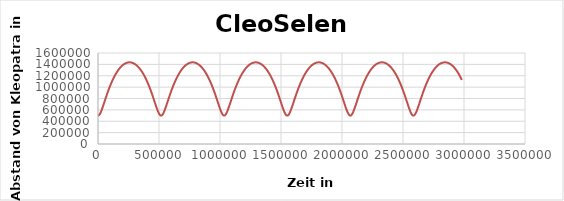
| Category | CleoSelene |
|---|---|
| 0.0 | 499000 |
| 3000.0 | 500168.055 |
| 6000.0 | 503644.83 |
| 9000.0 | 509350.566 |
| 12000.0 | 517159.925 |
| 15000.0 | 526911.892 |
| 18000.0 | 538421.155 |
| 21000.0 | 551489.378 |
| 24000.0 | 565915.145 |
| 27000.0 | 581501.897 |
| 30000.0 | 598063.638 |
| 33000.0 | 615428.585 |
| 36000.0 | 633441.069 |
| 39000.0 | 651962.131 |
| 42000.0 | 670869.187 |
| 45000.0 | 690055.098 |
| 48000.0 | 709426.911 |
| 51000.0 | 728904.446 |
| 54000.0 | 748418.857 |
| 57000.0 | 767911.251 |
| 60000.0 | 787331.403 |
| 63000.0 | 806636.596 |
| 66000.0 | 825790.58 |
| 69000.0 | 844762.67 |
| 72000.0 | 863526.948 |
| 75000.0 | 882061.578 |
| 78000.0 | 900348.216 |
| 81000.0 | 918371.506 |
| 84000.0 | 936118.64 |
| 87000.0 | 953578.987 |
| 90000.0 | 970743.781 |
| 93000.0 | 987605.843 |
| 96000.0 | 1004159.352 |
| 99000.0 | 1020399.647 |
| 102000.0 | 1036323.055 |
| 105000.0 | 1051926.749 |
| 108000.0 | 1067208.62 |
| 111000.0 | 1082167.172 |
| 114000.0 | 1096801.433 |
| 117000.0 | 1111110.869 |
| 120000.0 | 1125095.324 |
| 123000.0 | 1138754.957 |
| 126000.0 | 1152090.194 |
| 129000.0 | 1165101.683 |
| 132000.0 | 1177790.256 |
| 135000.0 | 1190156.901 |
| 138000.0 | 1202202.728 |
| 141000.0 | 1213928.949 |
| 144000.0 | 1225336.856 |
| 147000.0 | 1236427.801 |
| 150000.0 | 1247203.184 |
| 153000.0 | 1257664.436 |
| 156000.0 | 1267813.009 |
| 159000.0 | 1277650.364 |
| 162000.0 | 1287177.965 |
| 165000.0 | 1296397.269 |
| 168000.0 | 1305309.72 |
| 171000.0 | 1313916.744 |
| 174000.0 | 1322219.743 |
| 177000.0 | 1330220.09 |
| 180000.0 | 1337919.128 |
| 183000.0 | 1345318.165 |
| 186000.0 | 1352418.471 |
| 189000.0 | 1359221.276 |
| 192000.0 | 1365727.768 |
| 195000.0 | 1371939.093 |
| 198000.0 | 1377856.35 |
| 201000.0 | 1383480.593 |
| 204000.0 | 1388812.828 |
| 207000.0 | 1393854.013 |
| 210000.0 | 1398605.057 |
| 213000.0 | 1403066.819 |
| 216000.0 | 1407240.11 |
| 219000.0 | 1411125.689 |
| 222000.0 | 1414724.263 |
| 225000.0 | 1418036.489 |
| 228000.0 | 1421062.974 |
| 231000.0 | 1423804.271 |
| 234000.0 | 1426260.884 |
| 237000.0 | 1428433.263 |
| 240000.0 | 1430321.807 |
| 243000.0 | 1431926.863 |
| 246000.0 | 1433248.727 |
| 249000.0 | 1434287.642 |
| 252000.0 | 1435043.798 |
| 255000.0 | 1435517.336 |
| 258000.0 | 1435708.343 |
| 261000.0 | 1435616.853 |
| 264000.0 | 1435242.85 |
| 267000.0 | 1434586.265 |
| 270000.0 | 1433646.977 |
| 273000.0 | 1432424.813 |
| 276000.0 | 1430919.548 |
| 279000.0 | 1429130.906 |
| 282000.0 | 1427058.557 |
| 285000.0 | 1424702.12 |
| 288000.0 | 1422061.164 |
| 291000.0 | 1419135.203 |
| 294000.0 | 1415923.702 |
| 297000.0 | 1412426.072 |
| 300000.0 | 1408641.675 |
| 303000.0 | 1404569.821 |
| 306000.0 | 1400209.769 |
| 309000.0 | 1395560.726 |
| 312000.0 | 1390621.85 |
| 315000.0 | 1385392.251 |
| 318000.0 | 1379870.986 |
| 321000.0 | 1374057.068 |
| 324000.0 | 1367949.458 |
| 327000.0 | 1361547.073 |
| 330000.0 | 1354848.784 |
| 333000.0 | 1347853.417 |
| 336000.0 | 1340559.757 |
| 339000.0 | 1332966.548 |
| 342000.0 | 1325072.495 |
| 345000.0 | 1316876.267 |
| 348000.0 | 1308376.501 |
| 351000.0 | 1299571.804 |
| 354000.0 | 1290460.76 |
| 357000.0 | 1281041.928 |
| 360000.0 | 1271313.858 |
| 363000.0 | 1261275.085 |
| 366000.0 | 1250924.148 |
| 369000.0 | 1240259.589 |
| 372000.0 | 1229279.968 |
| 375000.0 | 1217983.875 |
| 378000.0 | 1206369.938 |
| 381000.0 | 1194436.842 |
| 384000.0 | 1182183.344 |
| 387000.0 | 1169608.296 |
| 390000.0 | 1156710.665 |
| 393000.0 | 1143489.56 |
| 396000.0 | 1129944.263 |
| 399000.0 | 1116074.266 |
| 402000.0 | 1101879.311 |
| 405000.0 | 1087359.437 |
| 408000.0 | 1072515.036 |
| 411000.0 | 1057346.919 |
| 414000.0 | 1041856.387 |
| 417000.0 | 1026045.322 |
| 420000.0 | 1009916.285 |
| 423000.0 | 993472.634 |
| 426000.0 | 976718.666 |
| 429000.0 | 959659.771 |
| 432000.0 | 942302.626 |
| 435000.0 | 924655.408 |
| 438000.0 | 906728.059 |
| 441000.0 | 888532.577 |
| 444000.0 | 870083.378 |
| 447000.0 | 851397.699 |
| 450000.0 | 832496.082 |
| 453000.0 | 813402.934 |
| 456000.0 | 794147.176 |
| 459000.0 | 774763.001 |
| 462000.0 | 755290.735 |
| 465000.0 | 735777.833 |
| 468000.0 | 716279.993 |
| 471000.0 | 696862.403 |
| 474000.0 | 677601.086 |
| 477000.0 | 658584.333 |
| 480000.0 | 639914.129 |
| 483000.0 | 621707.49 |
| 486000.0 | 604097.533 |
| 489000.0 | 587234.05 |
| 492000.0 | 571283.29 |
| 495000.0 | 556426.56 |
| 498000.0 | 542857.238 |
| 501000.0 | 530775.819 |
| 504000.0 | 520382.766 |
| 507000.0 | 511869.216 |
| 510000.0 | 505406.067 |
| 513000.0 | 501132.469 |
| 516000.0 | 499145.201 |
| 519000.0 | 499490.622 |
| 522000.0 | 502160.612 |
| 525000.0 | 507093.29 |
| 528000.0 | 514178.372 |
| 531000.0 | 523266.152 |
| 534000.0 | 534178.556 |
| 537000.0 | 546720.613 |
| 540000.0 | 560690.975 |
| 543000.0 | 575890.604 |
| 546000.0 | 592129.27 |
| 549000.0 | 609229.883 |
| 552000.0 | 627030.972 |
| 555000.0 | 645387.689 |
| 558000.0 | 664171.764 |
| 561000.0 | 683270.747 |
| 564000.0 | 702586.846 |
| 567000.0 | 722035.546 |
| 570000.0 | 741544.169 |
| 573000.0 | 761050.468 |
| 576000.0 | 780501.306 |
| 579000.0 | 799851.443 |
| 582000.0 | 819062.463 |
| 585000.0 | 838101.816 |
| 588000.0 | 856941.987 |
| 591000.0 | 875559.776 |
| 594000.0 | 893935.671 |
| 597000.0 | 912053.315 |
| 600000.0 | 929899.048 |
| 603000.0 | 947461.512 |
| 606000.0 | 964731.316 |
| 609000.0 | 981700.751 |
| 612000.0 | 998363.542 |
| 615000.0 | 1014714.64 |
| 618000.0 | 1030750.041 |
| 621000.0 | 1046466.636 |
| 624000.0 | 1061862.076 |
| 627000.0 | 1076934.661 |
| 630000.0 | 1091683.242 |
| 633000.0 | 1106107.14 |
| 636000.0 | 1120206.074 |
| 639000.0 | 1133980.097 |
| 642000.0 | 1147429.546 |
| 645000.0 | 1160554.995 |
| 648000.0 | 1173357.217 |
| 651000.0 | 1185837.148 |
| 654000.0 | 1197995.856 |
| 657000.0 | 1209834.521 |
| 660000.0 | 1221354.41 |
| 663000.0 | 1232556.854 |
| 666000.0 | 1243443.238 |
| 669000.0 | 1254014.985 |
| 672000.0 | 1264273.539 |
| 675000.0 | 1274220.36 |
| 678000.0 | 1283856.912 |
| 681000.0 | 1293184.654 |
| 684000.0 | 1302205.038 |
| 687000.0 | 1310919.494 |
| 690000.0 | 1319329.433 |
| 693000.0 | 1327436.241 |
| 696000.0 | 1335241.271 |
| 699000.0 | 1342745.843 |
| 702000.0 | 1349951.241 |
| 705000.0 | 1356858.709 |
| 708000.0 | 1363469.451 |
| 711000.0 | 1369784.627 |
| 714000.0 | 1375805.353 |
| 717000.0 | 1381532.699 |
| 720000.0 | 1386967.688 |
| 723000.0 | 1392111.295 |
| 726000.0 | 1396964.447 |
| 729000.0 | 1401528.02 |
| 732000.0 | 1405802.842 |
| 735000.0 | 1409789.69 |
| 738000.0 | 1413489.29 |
| 741000.0 | 1416902.316 |
| 744000.0 | 1420029.394 |
| 747000.0 | 1422871.094 |
| 750000.0 | 1425427.939 |
| 753000.0 | 1427700.397 |
| 756000.0 | 1429688.886 |
| 759000.0 | 1431393.771 |
| 762000.0 | 1432815.365 |
| 765000.0 | 1433953.93 |
| 768000.0 | 1434809.676 |
| 771000.0 | 1435382.759 |
| 774000.0 | 1435673.287 |
| 777000.0 | 1435681.312 |
| 780000.0 | 1435406.835 |
| 783000.0 | 1434849.807 |
| 786000.0 | 1434010.124 |
| 789000.0 | 1432887.632 |
| 792000.0 | 1431482.125 |
| 795000.0 | 1429793.343 |
| 798000.0 | 1427820.976 |
| 801000.0 | 1425564.662 |
| 804000.0 | 1423023.987 |
| 807000.0 | 1420198.483 |
| 810000.0 | 1417087.634 |
| 813000.0 | 1413690.869 |
| 816000.0 | 1410007.569 |
| 819000.0 | 1406037.06 |
| 822000.0 | 1401778.619 |
| 825000.0 | 1397231.472 |
| 828000.0 | 1392394.796 |
| 831000.0 | 1387267.715 |
| 834000.0 | 1381849.306 |
| 837000.0 | 1376138.597 |
| 840000.0 | 1370134.567 |
| 843000.0 | 1363836.149 |
| 846000.0 | 1357242.231 |
| 849000.0 | 1350351.652 |
| 852000.0 | 1343163.214 |
| 855000.0 | 1335675.674 |
| 858000.0 | 1327887.749 |
| 861000.0 | 1319798.122 |
| 864000.0 | 1311405.442 |
| 867000.0 | 1302708.324 |
| 870000.0 | 1293705.36 |
| 873000.0 | 1284395.118 |
| 876000.0 | 1274776.15 |
| 879000.0 | 1264846.996 |
| 882000.0 | 1254606.192 |
| 885000.0 | 1244052.278 |
| 888000.0 | 1233183.808 |
| 891000.0 | 1221999.358 |
| 894000.0 | 1210497.541 |
| 897000.0 | 1198677.021 |
| 900000.0 | 1186536.528 |
| 903000.0 | 1174074.878 |
| 906000.0 | 1161290.993 |
| 909000.0 | 1148183.93 |
| 912000.0 | 1134752.906 |
| 915000.0 | 1120997.335 |
| 918000.0 | 1106916.865 |
| 921000.0 | 1092511.425 |
| 924000.0 | 1077781.276 |
| 927000.0 | 1062727.074 |
| 930000.0 | 1047349.936 |
| 933000.0 | 1031651.531 |
| 936000.0 | 1015634.167 |
| 939000.0 | 999300.907 |
| 942000.0 | 982655.7 |
| 945000.0 | 965703.531 |
| 948000.0 | 948450.6 |
| 951000.0 | 930904.528 |
| 954000.0 | 913074.605 |
| 957000.0 | 894972.067 |
| 960000.0 | 876610.433 |
| 963000.0 | 858005.897 |
| 966000.0 | 839177.775 |
| 969000.0 | 820149.045 |
| 972000.0 | 800946.958 |
| 975000.0 | 781603.755 |
| 978000.0 | 762157.495 |
| 981000.0 | 742653.003 |
| 984000.0 | 723142.936 |
| 987000.0 | 703688.989 |
| 990000.0 | 684363.21 |
| 993000.0 | 665249.403 |
| 996000.0 | 646444.569 |
| 999000.0 | 628060.289 |
| 1002000.0 | 610223.91 |
| 1005000.0 | 593079.329 |
| 1008000.0 | 576787.087 |
| 1011000.0 | 561523.436 |
| 1014000.0 | 547477.96 |
| 1017000.0 | 534849.347 |
| 1020000.0 | 523839.026 |
| 1023000.0 | 514642.599 |
| 1026000.0 | 507439.404 |
| 1029000.0 | 502381.066 |
| 1032000.0 | 499580.376 |
| 1035000.0 | 499102.149 |
| 1038000.0 | 500957.626 |
| 1041000.0 | 505103.476 |
| 1044000.0 | 511445.602 |
| 1047000.0 | 519846.992 |
| 1050000.0 | 530138.246 |
| 1053000.0 | 542129.071 |
| 1056000.0 | 555619.268 |
| 1059000.0 | 570408.13 |
| 1062000.0 | 586301.722 |
| 1065000.0 | 603117.955 |
| 1068000.0 | 620689.675 |
| 1071000.0 | 638866.136 |
| 1074000.0 | 657513.286 |
| 1077000.0 | 676513.219 |
| 1080000.0 | 695763.129 |
| 1083000.0 | 715173.987 |
| 1086000.0 | 734669.11 |
| 1089000.0 | 754182.732 |
| 1092000.0 | 773658.651 |
| 1095000.0 | 793048.974 |
| 1098000.0 | 812312.997 |
| 1101000.0 | 831416.205 |
| 1104000.0 | 850329.397 |
| 1107000.0 | 869027.929 |
| 1110000.0 | 887491.054 |
| 1113000.0 | 905701.36 |
| 1116000.0 | 923644.286 |
| 1119000.0 | 941307.704 |
| 1122000.0 | 958681.564 |
| 1125000.0 | 975757.595 |
| 1128000.0 | 992529.043 |
| 1131000.0 | 1008990.449 |
| 1134000.0 | 1025137.459 |
| 1137000.0 | 1040966.665 |
| 1140000.0 | 1056475.463 |
| 1143000.0 | 1071661.938 |
| 1146000.0 | 1086524.756 |
| 1149000.0 | 1101063.082 |
| 1152000.0 | 1115276.502 |
| 1155000.0 | 1129164.956 |
| 1158000.0 | 1142728.689 |
| 1161000.0 | 1155968.196 |
| 1164000.0 | 1168884.183 |
| 1167000.0 | 1181477.531 |
| 1170000.0 | 1193749.267 |
| 1173000.0 | 1205700.534 |
| 1176000.0 | 1217332.57 |
| 1179000.0 | 1228646.685 |
| 1182000.0 | 1239644.247 |
| 1185000.0 | 1250326.668 |
| 1188000.0 | 1260695.385 |
| 1191000.0 | 1270751.853 |
| 1194000.0 | 1280497.537 |
| 1197000.0 | 1289933.898 |
| 1200000.0 | 1299062.391 |
| 1203000.0 | 1307884.454 |
| 1206000.0 | 1316401.507 |
| 1209000.0 | 1324614.943 |
| 1212000.0 | 1332526.129 |
| 1215000.0 | 1340136.395 |
| 1218000.0 | 1347447.039 |
| 1221000.0 | 1354459.32 |
| 1224000.0 | 1361174.455 |
| 1227000.0 | 1367593.621 |
| 1230000.0 | 1373717.949 |
| 1233000.0 | 1379548.525 |
| 1236000.0 | 1385086.389 |
| 1239000.0 | 1390332.534 |
| 1242000.0 | 1395287.902 |
| 1245000.0 | 1399953.389 |
| 1248000.0 | 1404329.838 |
| 1251000.0 | 1408418.046 |
| 1254000.0 | 1412218.755 |
| 1257000.0 | 1415732.659 |
| 1260000.0 | 1418960.4 |
| 1263000.0 | 1421902.569 |
| 1266000.0 | 1424559.704 |
| 1269000.0 | 1426932.293 |
| 1272000.0 | 1429020.772 |
| 1275000.0 | 1430825.524 |
| 1278000.0 | 1432346.88 |
| 1281000.0 | 1433585.122 |
| 1284000.0 | 1434540.476 |
| 1287000.0 | 1435213.119 |
| 1290000.0 | 1435603.174 |
| 1293000.0 | 1435710.714 |
| 1296000.0 | 1435535.758 |
| 1299000.0 | 1435078.273 |
| 1302000.0 | 1434338.176 |
| 1305000.0 | 1433315.331 |
| 1308000.0 | 1432009.548 |
| 1311000.0 | 1430420.589 |
| 1314000.0 | 1428548.16 |
| 1317000.0 | 1426391.917 |
| 1320000.0 | 1423951.464 |
| 1323000.0 | 1421226.354 |
| 1326000.0 | 1418216.086 |
| 1329000.0 | 1414920.109 |
| 1332000.0 | 1411337.821 |
| 1335000.0 | 1407468.567 |
| 1338000.0 | 1403311.642 |
| 1341000.0 | 1398866.29 |
| 1344000.0 | 1394131.704 |
| 1347000.0 | 1389107.027 |
| 1350000.0 | 1383791.353 |
| 1353000.0 | 1378183.727 |
| 1356000.0 | 1372283.145 |
| 1359000.0 | 1366088.556 |
| 1362000.0 | 1359598.864 |
| 1365000.0 | 1352812.925 |
| 1368000.0 | 1345729.554 |
| 1371000.0 | 1338347.523 |
| 1374000.0 | 1330665.564 |
| 1377000.0 | 1322682.371 |
| 1380000.0 | 1314396.603 |
| 1383000.0 | 1305806.89 |
| 1386000.0 | 1296911.829 |
| 1389000.0 | 1287709.997 |
| 1392000.0 | 1278199.95 |
| 1395000.0 | 1268380.233 |
| 1398000.0 | 1258249.381 |
| 1401000.0 | 1247805.933 |
| 1404000.0 | 1237048.435 |
| 1407000.0 | 1225975.456 |
| 1410000.0 | 1214585.594 |
| 1413000.0 | 1202877.493 |
| 1416000.0 | 1190849.857 |
| 1419000.0 | 1178501.47 |
| 1422000.0 | 1165831.214 |
| 1425000.0 | 1152838.096 |
| 1428000.0 | 1139521.272 |
| 1431000.0 | 1125880.082 |
| 1434000.0 | 1111914.089 |
| 1437000.0 | 1097623.115 |
| 1440000.0 | 1083007.299 |
| 1443000.0 | 1068067.149 |
| 1446000.0 | 1052803.612 |
| 1449000.0 | 1037218.152 |
| 1452000.0 | 1021312.84 |
| 1455000.0 | 1005090.459 |
| 1458000.0 | 988554.63 |
| 1461000.0 | 971709.954 |
| 1464000.0 | 954562.181 |
| 1467000.0 | 937118.406 |
| 1470000.0 | 919387.301 |
| 1473000.0 | 901379.379 |
| 1476000.0 | 883107.317 |
| 1479000.0 | 864586.315 |
| 1482000.0 | 845834.535 |
| 1485000.0 | 826873.599 |
| 1488000.0 | 807729.175 |
| 1491000.0 | 788431.659 |
| 1494000.0 | 769016.958 |
| 1497000.0 | 749527.399 |
| 1500000.0 | 730012.749 |
| 1503000.0 | 710531.374 |
| 1506000.0 | 691151.52 |
| 1509000.0 | 671952.683 |
| 1512000.0 | 653027.055 |
| 1515000.0 | 634480.929 |
| 1518000.0 | 616435.985 |
| 1521000.0 | 599030.235 |
| 1524000.0 | 582418.404 |
| 1527000.0 | 566771.397 |
| 1530000.0 | 552274.481 |
| 1533000.0 | 539123.747 |
| 1536000.0 | 527520.528 |
| 1539000.0 | 517663.584 |
| 1542000.0 | 509739.261 |
| 1545000.0 | 503910.265 |
| 1548000.0 | 500304.249 |
| 1551000.0 | 499003.778 |
| 1554000.0 | 500039.328 |
| 1557000.0 | 503386.601 |
| 1560000.0 | 508968.67 |
| 1563000.0 | 516662.543 |
| 1566000.0 | 526308.931 |
| 1569000.0 | 537723.595 |
| 1572000.0 | 550708.655 |
| 1575000.0 | 565062.638 |
| 1578000.0 | 580588.533 |
| 1581000.0 | 597099.63 |
| 1584000.0 | 614423.271 |
| 1587000.0 | 632402.846 |
| 1590000.0 | 650898.45 |
| 1593000.0 | 669786.587 |
| 1596000.0 | 688959.273 |
| 1599000.0 | 708322.786 |
| 1602000.0 | 727796.26 |
| 1605000.0 | 747310.242 |
| 1608000.0 | 766805.308 |
| 1611000.0 | 786230.775 |
| 1614000.0 | 805543.527 |
| 1617000.0 | 824706.973 |
| 1620000.0 | 843690.133 |
| 1623000.0 | 862466.838 |
| 1626000.0 | 881015.037 |
| 1629000.0 | 899316.203 |
| 1632000.0 | 917354.82 |
| 1635000.0 | 935117.947 |
| 1638000.0 | 952594.839 |
| 1641000.0 | 969776.631 |
| 1644000.0 | 986656.06 |
| 1647000.0 | 1003227.234 |
| 1650000.0 | 1019485.431 |
| 1653000.0 | 1035426.926 |
| 1656000.0 | 1051048.846 |
| 1659000.0 | 1066349.047 |
| 1662000.0 | 1081325.999 |
| 1665000.0 | 1095978.702 |
| 1668000.0 | 1110306.6 |
| 1671000.0 | 1124309.517 |
| 1674000.0 | 1137987.596 |
| 1677000.0 | 1151341.247 |
| 1680000.0 | 1164371.109 |
| 1683000.0 | 1177078.003 |
| 1686000.0 | 1189462.909 |
| 1689000.0 | 1201526.932 |
| 1692000.0 | 1213271.277 |
| 1695000.0 | 1224697.233 |
| 1698000.0 | 1235806.149 |
| 1701000.0 | 1246599.422 |
| 1704000.0 | 1257078.482 |
| 1707000.0 | 1267244.78 |
| 1710000.0 | 1277099.777 |
| 1713000.0 | 1286644.938 |
| 1716000.0 | 1295881.718 |
| 1719000.0 | 1304811.565 |
| 1722000.0 | 1313435.904 |
| 1725000.0 | 1321756.138 |
| 1728000.0 | 1329773.644 |
| 1731000.0 | 1337489.765 |
| 1734000.0 | 1344905.812 |
| 1737000.0 | 1352023.057 |
| 1740000.0 | 1358842.732 |
| 1743000.0 | 1365366.028 |
| 1746000.0 | 1371594.092 |
| 1749000.0 | 1377528.028 |
| 1752000.0 | 1383168.89 |
| 1755000.0 | 1388517.689 |
| 1758000.0 | 1393575.385 |
| 1761000.0 | 1398342.889 |
| 1764000.0 | 1402821.065 |
| 1767000.0 | 1407010.725 |
| 1770000.0 | 1410912.63 |
| 1773000.0 | 1414527.491 |
| 1776000.0 | 1417855.969 |
| 1779000.0 | 1420898.673 |
| 1782000.0 | 1423656.159 |
| 1785000.0 | 1426128.933 |
| 1788000.0 | 1428317.449 |
| 1791000.0 | 1430222.109 |
| 1794000.0 | 1431843.263 |
| 1797000.0 | 1433181.21 |
| 1800000.0 | 1434236.194 |
| 1803000.0 | 1435008.411 |
| 1806000.0 | 1435498.003 |
| 1809000.0 | 1435705.06 |
| 1812000.0 | 1435629.62 |
| 1815000.0 | 1435271.669 |
| 1818000.0 | 1434631.141 |
| 1821000.0 | 1433707.919 |
| 1824000.0 | 1432501.832 |
| 1827000.0 | 1431012.658 |
| 1830000.0 | 1429240.124 |
| 1833000.0 | 1427183.903 |
| 1836000.0 | 1424843.618 |
| 1839000.0 | 1422218.838 |
| 1842000.0 | 1419309.084 |
| 1845000.0 | 1416113.82 |
| 1848000.0 | 1412632.463 |
| 1851000.0 | 1408864.377 |
| 1854000.0 | 1404808.874 |
| 1857000.0 | 1400465.216 |
| 1860000.0 | 1395832.614 |
| 1863000.0 | 1390910.228 |
| 1866000.0 | 1385697.171 |
| 1869000.0 | 1380192.503 |
| 1872000.0 | 1374395.238 |
| 1875000.0 | 1368304.343 |
| 1878000.0 | 1361918.735 |
| 1881000.0 | 1355237.288 |
| 1884000.0 | 1348258.832 |
| 1887000.0 | 1340982.153 |
| 1890000.0 | 1333405.997 |
| 1893000.0 | 1325529.071 |
| 1896000.0 | 1317350.047 |
| 1899000.0 | 1308867.563 |
| 1902000.0 | 1300080.229 |
| 1905000.0 | 1290986.627 |
| 1908000.0 | 1281585.322 |
| 1911000.0 | 1271874.859 |
| 1914000.0 | 1261853.778 |
| 1917000.0 | 1251520.615 |
| 1920000.0 | 1240873.913 |
| 1923000.0 | 1229912.231 |
| 1926000.0 | 1218634.155 |
| 1929000.0 | 1207038.311 |
| 1932000.0 | 1195123.382 |
| 1935000.0 | 1182888.119 |
| 1938000.0 | 1170331.369 |
| 1941000.0 | 1157452.09 |
| 1944000.0 | 1144249.384 |
| 1947000.0 | 1130722.521 |
| 1950000.0 | 1116870.981 |
| 1953000.0 | 1102694.49 |
| 1956000.0 | 1088193.069 |
| 1959000.0 | 1073367.089 |
| 1962000.0 | 1058217.333 |
| 1965000.0 | 1042745.075 |
| 1968000.0 | 1026952.159 |
| 1971000.0 | 1010841.105 |
| 1974000.0 | 994415.223 |
| 1977000.0 | 977678.752 |
| 1980000.0 | 960637.016 |
| 1983000.0 | 943296.611 |
| 1986000.0 | 925665.625 |
| 1989000.0 | 907753.891 |
| 1992000.0 | 889573.281 |
| 1995000.0 | 871138.064 |
| 1998000.0 | 852465.303 |
| 2001000.0 | 833575.34 |
| 2004000.0 | 814492.344 |
| 2007000.0 | 795244.963 |
| 2010000.0 | 775867.065 |
| 2013000.0 | 756398.604 |
| 2016000.0 | 736886.602 |
| 2019000.0 | 717386.256 |
| 2022000.0 | 697962.178 |
| 2025000.0 | 678689.739 |
| 2028000.0 | 659656.495 |
| 2031000.0 | 640963.614 |
| 2034000.0 | 622727.228 |
| 2037000.0 | 605079.515 |
| 2040000.0 | 588169.319 |
| 2043000.0 | 572161.978 |
| 2046000.0 | 557238.006 |
| 2049000.0 | 543590.207 |
| 2052000.0 | 531418.845 |
| 2055000.0 | 520924.612 |
| 2058000.0 | 512299.457 |
| 2061000.0 | 505715.737 |
| 2064000.0 | 501314.705 |
| 2067000.0 | 499195.797 |
| 2070000.0 | 499408.386 |
| 2073000.0 | 501947.475 |
| 2076000.0 | 506754.134 |
| 2079000.0 | 513720.617 |
| 2082000.0 | 522699.173 |
| 2085000.0 | 533513.028 |
| 2088000.0 | 545967.876 |
| 2091000.0 | 559862.478 |
| 2094000.0 | 574997.472 |
| 2097000.0 | 591181.99 |
| 2100000.0 | 608238.113 |
| 2103000.0 | 626003.444 |
| 2106000.0 | 644332.184 |
| 2109000.0 | 663095.136 |
| 2112000.0 | 682178.981 |
| 2115000.0 | 701485.128 |
| 2118000.0 | 720928.346 |
| 2121000.0 | 740435.325 |
| 2124000.0 | 759943.261 |
| 2127000.0 | 779398.531 |
| 2130000.0 | 798755.478 |
| 2133000.0 | 817975.325 |
| 2136000.0 | 837025.212 |
| 2139000.0 | 855877.359 |
| 2142000.0 | 874508.338 |
| 2145000.0 | 892898.441 |
| 2148000.0 | 911031.147 |
| 2151000.0 | 928892.653 |
| 2154000.0 | 946471.479 |
| 2157000.0 | 963758.132 |
| 2160000.0 | 980744.812 |
| 2163000.0 | 997425.171 |
| 2166000.0 | 1013794.094 |
| 2169000.0 | 1029847.522 |
| 2172000.0 | 1045582.3 |
| 2175000.0 | 1060996.037 |
| 2178000.0 | 1076087 |
| 2181000.0 | 1090854.011 |
| 2184000.0 | 1105296.367 |
| 2187000.0 | 1119413.764 |
| 2190000.0 | 1133206.24 |
| 2193000.0 | 1146674.116 |
| 2196000.0 | 1159817.955 |
| 2199000.0 | 1172638.517 |
| 2202000.0 | 1185136.73 |
| 2205000.0 | 1197313.658 |
| 2208000.0 | 1209170.473 |
| 2211000.0 | 1220708.437 |
| 2214000.0 | 1231928.88 |
| 2217000.0 | 1242833.183 |
| 2220000.0 | 1253422.767 |
| 2223000.0 | 1263699.076 |
| 2226000.0 | 1273663.568 |
| 2229000.0 | 1283317.708 |
| 2232000.0 | 1292662.957 |
| 2235000.0 | 1301700.764 |
| 2238000.0 | 1310432.563 |
| 2241000.0 | 1318859.766 |
| 2244000.0 | 1326983.759 |
| 2247000.0 | 1334805.899 |
| 2250000.0 | 1342327.506 |
| 2253000.0 | 1349549.867 |
| 2256000.0 | 1356474.229 |
| 2259000.0 | 1363101.798 |
| 2262000.0 | 1369433.736 |
| 2265000.0 | 1375471.162 |
| 2268000.0 | 1381215.148 |
| 2271000.0 | 1386666.72 |
| 2274000.0 | 1391826.857 |
| 2277000.0 | 1396696.486 |
| 2280000.0 | 1401276.489 |
| 2283000.0 | 1405567.695 |
| 2286000.0 | 1409570.884 |
| 2289000.0 | 1413286.785 |
| 2292000.0 | 1416716.076 |
| 2295000.0 | 1419859.383 |
| 2298000.0 | 1422717.283 |
| 2301000.0 | 1425290.299 |
| 2304000.0 | 1427578.902 |
| 2307000.0 | 1429583.514 |
| 2310000.0 | 1431304.502 |
| 2313000.0 | 1432742.184 |
| 2316000.0 | 1433896.823 |
| 2319000.0 | 1434768.632 |
| 2322000.0 | 1435357.772 |
| 2325000.0 | 1435664.35 |
| 2328000.0 | 1435688.425 |
| 2331000.0 | 1435429.999 |
| 2334000.0 | 1434889.026 |
| 2337000.0 | 1434065.405 |
| 2340000.0 | 1432958.986 |
| 2343000.0 | 1431569.564 |
| 2346000.0 | 1429896.884 |
| 2349000.0 | 1427940.638 |
| 2352000.0 | 1425700.467 |
| 2355000.0 | 1423175.959 |
| 2358000.0 | 1420366.651 |
| 2361000.0 | 1417272.029 |
| 2364000.0 | 1413891.524 |
| 2367000.0 | 1410224.52 |
| 2370000.0 | 1406270.348 |
| 2373000.0 | 1402028.285 |
| 2376000.0 | 1397497.563 |
| 2379000.0 | 1392677.359 |
| 2382000.0 | 1387566.801 |
| 2385000.0 | 1382164.97 |
| 2388000.0 | 1376470.894 |
| 2391000.0 | 1370483.557 |
| 2394000.0 | 1364201.894 |
| 2397000.0 | 1357624.795 |
| 2400000.0 | 1350751.103 |
| 2403000.0 | 1343579.62 |
| 2406000.0 | 1336109.107 |
| 2409000.0 | 1328338.283 |
| 2412000.0 | 1320265.833 |
| 2415000.0 | 1311890.407 |
| 2418000.0 | 1303210.623 |
| 2421000.0 | 1294225.074 |
| 2424000.0 | 1284932.328 |
| 2427000.0 | 1275330.939 |
| 2430000.0 | 1265419.447 |
| 2433000.0 | 1255196.388 |
| 2436000.0 | 1244660.302 |
| 2439000.0 | 1233809.742 |
| 2442000.0 | 1222643.281 |
| 2445000.0 | 1211159.532 |
| 2448000.0 | 1199357.154 |
| 2451000.0 | 1187234.872 |
| 2454000.0 | 1174791.498 |
| 2457000.0 | 1162025.947 |
| 2460000.0 | 1148937.268 |
| 2463000.0 | 1135524.667 |
| 2466000.0 | 1121787.546 |
| 2469000.0 | 1107725.54 |
| 2472000.0 | 1093338.56 |
| 2475000.0 | 1078626.845 |
| 2478000.0 | 1063591.028 |
| 2481000.0 | 1048232.199 |
| 2484000.0 | 1032551.991 |
| 2487000.0 | 1016552.674 |
| 2490000.0 | 1000237.264 |
| 2493000.0 | 983609.657 |
| 2496000.0 | 966674.774 |
| 2499000.0 | 949438.741 |
| 2502000.0 | 931909.092 |
| 2505000.0 | 914095.014 |
| 2508000.0 | 896007.625 |
| 2511000.0 | 877660.305 |
| 2514000.0 | 859069.083 |
| 2517000.0 | 840253.086 |
| 2520000.0 | 821235.067 |
| 2523000.0 | 802042.015 |
| 2526000.0 | 782705.869 |
| 2529000.0 | 763264.332 |
| 2532000.0 | 743761.816 |
| 2535000.0 | 724250.504 |
| 2538000.0 | 704791.543 |
| 2541000.0 | 685456.354 |
| 2544000.0 | 666328.037 |
| 2547000.0 | 647502.802 |
| 2550000.0 | 629091.37 |
| 2553000.0 | 611220.166 |
| 2556000.0 | 594032.134 |
| 2559000.0 | 577686.886 |
| 2562000.0 | 562359.828 |
| 2565000.0 | 548239.879 |
| 2568000.0 | 535525.362 |
| 2571000.0 | 524417.759 |
| 2574000.0 | 515113.268 |
| 2577000.0 | 507792.452 |
| 2580000.0 | 502608.82 |
| 2583000.0 | 499677.642 |
| 2586000.0 | 499066.646 |
| 2589000.0 | 500790.189 |
| 2592000.0 | 504807.986 |
| 2595000.0 | 511028.643 |
| 2598000.0 | 519317.324 |
| 2601000.0 | 529506.16 |
| 2604000.0 | 541405.743 |
| 2607000.0 | 554816.166 |
| 2610000.0 | 569536.533 |
| 2613000.0 | 585372.369 |
| 2616000.0 | 602140.812 |
| 2619000.0 | 619673.806 |
| 2622000.0 | 637819.658 |
| 2625000.0 | 656443.373 |
| 2628000.0 | 675426.155 |
| 2631000.0 | 694664.371 |
| 2634000.0 | 714068.25 |
| 2637000.0 | 733560.444 |
| 2640000.0 | 753074.605 |
| 2643000.0 | 772554.022 |
| 2646000.0 | 791950.362 |
| 2649000.0 | 811222.54 |
| 2652000.0 | 830335.713 |
| 2655000.0 | 849260.401 |
| 2658000.0 | 867971.718 |
| 2661000.0 | 886448.713 |
| 2664000.0 | 904673.799 |
| 2667000.0 | 922632.262 |
| 2670000.0 | 940311.846 |
| 2673000.0 | 957702.395 |
| 2676000.0 | 974795.541 |
| 2679000.0 | 991584.451 |
| 2682000.0 | 1008063.598 |
| 2685000.0 | 1024228.569 |
| 2688000.0 | 1040075.908 |
| 2691000.0 | 1055602.967 |
| 2694000.0 | 1070807.795 |
| 2697000.0 | 1085689.029 |
| 2700000.0 | 1100245.805 |
| 2703000.0 | 1114477.688 |
| 2706000.0 | 1128384.601 |
| 2709000.0 | 1141966.772 |
| 2712000.0 | 1155224.682 |
| 2715000.0 | 1168159.027 |
| 2718000.0 | 1180770.68 |
| 2721000.0 | 1193060.659 |
| 2724000.0 | 1205030.101 |
| 2727000.0 | 1216680.238 |
| 2730000.0 | 1228012.379 |
| 2733000.0 | 1239027.889 |
| 2736000.0 | 1249728.176 |
| 2739000.0 | 1260114.676 |
| 2742000.0 | 1270188.846 |
| 2745000.0 | 1279952.147 |
| 2748000.0 | 1289406.044 |
| 2751000.0 | 1298551.989 |
| 2754000.0 | 1307391.423 |
| 2757000.0 | 1315925.767 |
| 2760000.0 | 1324156.416 |
| 2763000.0 | 1332084.738 |
| 2766000.0 | 1339712.065 |
| 2769000.0 | 1347039.698 |
| 2772000.0 | 1354068.897 |
| 2775000.0 | 1360800.882 |
| 2778000.0 | 1367236.833 |
| 2781000.0 | 1373377.882 |
| 2784000.0 | 1379225.119 |
| 2787000.0 | 1384779.586 |
| 2790000.0 | 1390042.279 |
| 2793000.0 | 1395014.143 |
| 2796000.0 | 1399696.076 |
| 2799000.0 | 1404088.925 |
| 2802000.0 | 1408193.488 |
| 2805000.0 | 1412010.512 |
| 2808000.0 | 1415540.693 |
| 2811000.0 | 1418784.676 |
| 2814000.0 | 1421743.055 |
| 2817000.0 | 1424416.37 |
| 2820000.0 | 1426805.113 |
| 2823000.0 | 1428909.723 |
| 2826000.0 | 1430730.584 |
| 2829000.0 | 1432268.034 |
| 2832000.0 | 1433522.354 |
| 2835000.0 | 1434493.775 |
| 2838000.0 | 1435182.476 |
| 2841000.0 | 1435588.584 |
| 2844000.0 | 1435712.173 |
| 2847000.0 | 1435553.267 |
| 2850000.0 | 1435111.836 |
| 2853000.0 | 1434387.798 |
| 2856000.0 | 1433381.021 |
| 2859000.0 | 1432091.32 |
| 2862000.0 | 1430518.456 |
| 2865000.0 | 1428662.141 |
| 2868000.0 | 1426522.032 |
| 2871000.0 | 1424097.738 |
| 2874000.0 | 1421388.813 |
| 2877000.0 | 1418394.761 |
| 2880000.0 | 1415115.032 |
| 2883000.0 | 1411549.028 |
| 2886000.0 | 1407696.096 |
| 2889000.0 | 1403555.534 |
| 2892000.0 | 1399126.59 |
| 2895000.0 | 1394408.459 |
| 2898000.0 | 1389400.287 |
| 2901000.0 | 1384101.171 |
| 2904000.0 | 1378510.158 |
| 2907000.0 | 1372626.248 |
| 2910000.0 | 1366448.392 |
| 2913000.0 | 1359975.496 |
| 2916000.0 | 1353206.419 |
| 2919000.0 | 1346139.979 |
| 2922000.0 | 1338774.95 |
| 2925000.0 | 1331110.065 |
| 2928000.0 | 1323144.022 |
| 2931000.0 | 1314875.481 |
| 2934000.0 | 1306303.073 |
| 2937000.0 | 1297425.398 |
| 2940000.0 | 1288241.034 |
| 2943000.0 | 1278748.537 |
| 2946000.0 | 1268946.452 |
| 2949000.0 | 1258833.317 |
| 2952000.0 | 1248407.667 |
| 2955000.0 | 1237668.051 |
| 2958000.0 | 1226613.033 |
| 2961000.0 | 1215241.212 |
| 2964000.0 | 1203551.226 |
| 2967000.0 | 1191541.778 |
| 2970000.0 | 1179211.645 |
| 2973000.0 | 1166559.704 |
| 2976000.0 | 1153584.953 |
| 2979000.0 | 1140286.539 |
| 2982000.0 | 1126663.792 |